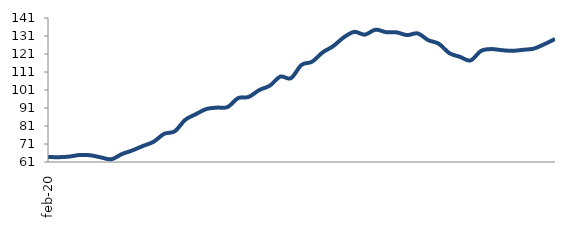
| Category | Series 0 |
|---|---|
| 2020-02-01 | 63.811 |
| 2020-03-01 | 63.665 |
| 2020-04-01 | 64.013 |
| 2020-05-01 | 64.885 |
| 2020-06-01 | 64.73 |
| 2020-07-01 | 63.568 |
| 2020-08-01 | 62.507 |
| 2020-09-01 | 65.409 |
| 2020-10-01 | 67.466 |
| 2020-11-01 | 69.929 |
| 2020-12-01 | 72.262 |
| 2021-01-01 | 76.667 |
| 2021-02-01 | 78.05 |
| 2021-03-01 | 84.474 |
| 2021-04-01 | 87.564 |
| 2021-05-01 | 90.47 |
| 2021-06-01 | 91.204 |
| 2021-07-01 | 91.538 |
| 2021-08-01 | 96.497 |
| 2021-09-01 | 97.152 |
| 2021-10-01 | 100.957 |
| 2021-11-01 | 103.422 |
| 2021-12-01 | 108.432 |
| 2022-01-01 | 107.584 |
| 2022-02-01 | 114.937 |
| 2022-03-01 | 116.708 |
| 2022-04-01 | 121.877 |
| 2022-05-01 | 125.358 |
| 2022-06-01 | 130.237 |
| 2022-07-01 | 133.304 |
| 2022-08-01 | 131.751 |
| 2022-09-01 | 134.487 |
| 2022-10-01 | 133.139 |
| 2022-11-01 | 133.012 |
| 2022-12-01 | 131.496 |
| 2023-01-01 | 132.43 |
| 2023-02-01 | 128.69 |
| 2023-03-01 | 126.696 |
| 2023-04-01 | 121.465 |
| 2023-05-01 | 119.417 |
| 2023-06-01 | 117.407 |
| 2023-07-01 | 122.739 |
| 2023-08-01 | 123.725 |
| 2023-09-01 | 123.094 |
| 2023-10-01 | 122.773 |
| 2023-11-01 | 123.345 |
| 2023-12-01 | 123.998 |
| 2024-01-01 | 126.466 |
| 2024-02-01 | 129.31 |